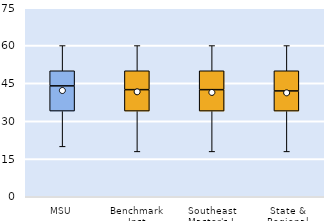
| Category | 25th | 50th | 75th |
|---|---|---|---|
| MSU | 34 | 10 | 6 |
| Benchmark Inst | 34 | 8.5 | 7.5 |
| Southeast Master's-L | 34 | 8.5 | 7.5 |
| State & Regional | 34 | 8 | 8 |